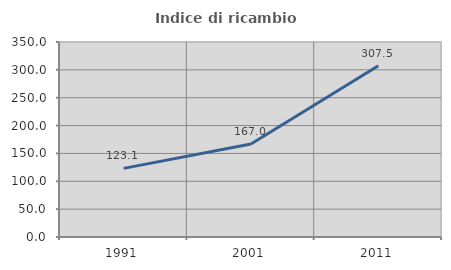
| Category | Indice di ricambio occupazionale  |
|---|---|
| 1991.0 | 123.137 |
| 2001.0 | 167.032 |
| 2011.0 | 307.453 |